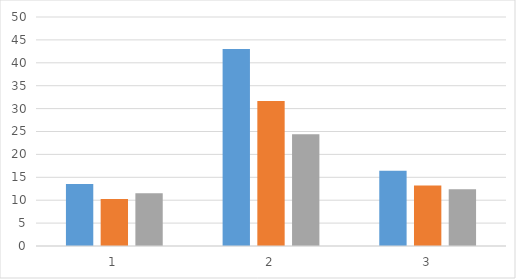
| Category | control | 5 min | 20 min |
|---|---|---|---|
| 0 | 13.526 | 10.262 | 11.522 |
| 1 | 43.004 | 31.642 | 24.411 |
| 2 | 16.441 | 13.188 | 12.404 |